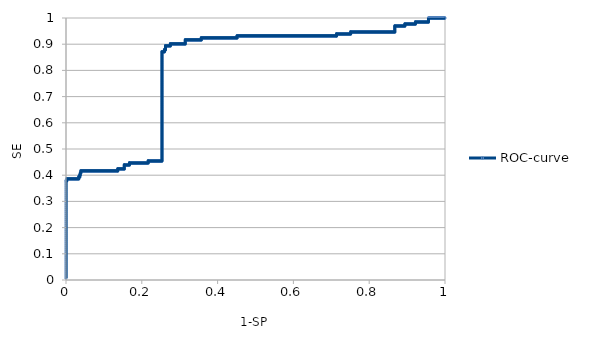
| Category | ROC-curve |
|---|---|
| 0.0 | 0.008 |
| 0.0 | 0.015 |
| 0.0 | 0.023 |
| 0.0 | 0.03 |
| 0.0 | 0.038 |
| 0.0 | 0.045 |
| 0.0 | 0.053 |
| 0.0 | 0.061 |
| 0.0 | 0.068 |
| 0.0 | 0.076 |
| 0.0 | 0.083 |
| 0.0 | 0.091 |
| 0.0 | 0.098 |
| 0.0 | 0.106 |
| 0.0 | 0.114 |
| 0.0 | 0.121 |
| 0.0 | 0.129 |
| 0.0 | 0.136 |
| 0.0 | 0.144 |
| 0.0 | 0.152 |
| 0.0 | 0.159 |
| 0.0 | 0.167 |
| 0.0 | 0.174 |
| 0.0 | 0.182 |
| 0.0 | 0.189 |
| 0.0 | 0.197 |
| 0.0 | 0.205 |
| 0.0 | 0.212 |
| 0.0 | 0.22 |
| 0.0 | 0.227 |
| 0.0 | 0.235 |
| 0.0 | 0.242 |
| 0.0 | 0.25 |
| 0.0 | 0.258 |
| 0.0 | 0.265 |
| 0.0 | 0.273 |
| 0.0 | 0.28 |
| 0.0 | 0.288 |
| 0.0 | 0.295 |
| 0.0 | 0.303 |
| 0.0 | 0.311 |
| 0.0 | 0.318 |
| 0.0 | 0.326 |
| 0.0 | 0.333 |
| 0.0 | 0.341 |
| 0.0 | 0.348 |
| 0.0 | 0.356 |
| 0.0 | 0.364 |
| 0.0 | 0.371 |
| 0.0 | 0.379 |
| 0.000715307582260349 | 0.379 |
| 0.0014306151645207 | 0.379 |
| 0.00214592274678116 | 0.379 |
| 0.00214592274678116 | 0.386 |
| 0.00286123032904151 | 0.386 |
| 0.00357653791130186 | 0.386 |
| 0.00429184549356221 | 0.386 |
| 0.00500715307582256 | 0.386 |
| 0.00572246065808302 | 0.386 |
| 0.00643776824034337 | 0.386 |
| 0.00715307582260372 | 0.386 |
| 0.00786838340486407 | 0.386 |
| 0.00858369098712442 | 0.386 |
| 0.00929899856938487 | 0.386 |
| 0.0100143061516452 | 0.386 |
| 0.0107296137339056 | 0.386 |
| 0.0114449213161659 | 0.386 |
| 0.0121602288984263 | 0.386 |
| 0.0128755364806867 | 0.386 |
| 0.0135908440629471 | 0.386 |
| 0.0143061516452074 | 0.386 |
| 0.0150214592274678 | 0.386 |
| 0.0157367668097281 | 0.386 |
| 0.0164520743919886 | 0.386 |
| 0.0171673819742489 | 0.386 |
| 0.0178826895565093 | 0.386 |
| 0.0185979971387696 | 0.386 |
| 0.01931330472103 | 0.386 |
| 0.0200286123032904 | 0.386 |
| 0.0207439198855508 | 0.386 |
| 0.0214592274678111 | 0.386 |
| 0.0221745350500715 | 0.386 |
| 0.022889842632332 | 0.386 |
| 0.0236051502145923 | 0.386 |
| 0.0243204577968527 | 0.386 |
| 0.025035765379113 | 0.386 |
| 0.0257510729613734 | 0.386 |
| 0.0264663805436338 | 0.386 |
| 0.0271816881258942 | 0.386 |
| 0.0278969957081545 | 0.386 |
| 0.0286123032904149 | 0.386 |
| 0.0293276108726752 | 0.386 |
| 0.0300429184549357 | 0.386 |
| 0.030758226037196 | 0.386 |
| 0.0314735336194564 | 0.386 |
| 0.0321888412017167 | 0.386 |
| 0.0329041487839771 | 0.386 |
| 0.0336194563662375 | 0.386 |
| 0.0336194563662375 | 0.394 |
| 0.0343347639484979 | 0.394 |
| 0.0350500715307582 | 0.394 |
| 0.0357653791130186 | 0.394 |
| 0.0364806866952789 | 0.394 |
| 0.0364806866952789 | 0.402 |
| 0.0371959942775394 | 0.402 |
| 0.0379113018597997 | 0.402 |
| 0.0379113018597997 | 0.409 |
| 0.0386266094420601 | 0.409 |
| 0.0393419170243204 | 0.409 |
| 0.0393419170243204 | 0.417 |
| 0.0400572246065808 | 0.417 |
| 0.0407725321888413 | 0.417 |
| 0.0414878397711016 | 0.417 |
| 0.042203147353362 | 0.417 |
| 0.0429184549356223 | 0.417 |
| 0.0436337625178826 | 0.417 |
| 0.0443490701001431 | 0.417 |
| 0.0450643776824035 | 0.417 |
| 0.0457796852646638 | 0.417 |
| 0.0464949928469242 | 0.417 |
| 0.0472103004291845 | 0.417 |
| 0.047925608011445 | 0.417 |
| 0.0486409155937053 | 0.417 |
| 0.0493562231759657 | 0.417 |
| 0.050071530758226 | 0.417 |
| 0.0507868383404864 | 0.417 |
| 0.0515021459227468 | 0.417 |
| 0.0522174535050072 | 0.417 |
| 0.0529327610872675 | 0.417 |
| 0.0536480686695279 | 0.417 |
| 0.0543633762517882 | 0.417 |
| 0.0550786838340487 | 0.417 |
| 0.055793991416309 | 0.417 |
| 0.0565092989985694 | 0.417 |
| 0.0572246065808297 | 0.417 |
| 0.0579399141630901 | 0.417 |
| 0.0586552217453505 | 0.417 |
| 0.0593705293276109 | 0.417 |
| 0.0600858369098712 | 0.417 |
| 0.0608011444921316 | 0.417 |
| 0.0615164520743919 | 0.417 |
| 0.0622317596566524 | 0.417 |
| 0.0629470672389127 | 0.417 |
| 0.0636623748211731 | 0.417 |
| 0.0643776824034334 | 0.417 |
| 0.0650929899856938 | 0.417 |
| 0.0658082975679543 | 0.417 |
| 0.0665236051502146 | 0.417 |
| 0.067238912732475 | 0.417 |
| 0.0679542203147353 | 0.417 |
| 0.0686695278969958 | 0.417 |
| 0.0693848354792561 | 0.417 |
| 0.0701001430615165 | 0.417 |
| 0.0708154506437768 | 0.417 |
| 0.0715307582260372 | 0.417 |
| 0.0722460658082976 | 0.417 |
| 0.072961373390558 | 0.417 |
| 0.0736766809728183 | 0.417 |
| 0.0743919885550787 | 0.417 |
| 0.075107296137339 | 0.417 |
| 0.0758226037195995 | 0.417 |
| 0.0765379113018598 | 0.417 |
| 0.0772532188841202 | 0.417 |
| 0.0779685264663805 | 0.417 |
| 0.0786838340486409 | 0.417 |
| 0.0793991416309013 | 0.417 |
| 0.0801144492131617 | 0.417 |
| 0.080829756795422 | 0.417 |
| 0.0815450643776824 | 0.417 |
| 0.0822603719599427 | 0.417 |
| 0.0829756795422032 | 0.417 |
| 0.0836909871244635 | 0.417 |
| 0.0844062947067239 | 0.417 |
| 0.0851216022889842 | 0.417 |
| 0.0858369098712446 | 0.417 |
| 0.0865522174535051 | 0.417 |
| 0.0872675250357654 | 0.417 |
| 0.0879828326180258 | 0.417 |
| 0.0886981402002861 | 0.417 |
| 0.0894134477825465 | 0.417 |
| 0.0901287553648069 | 0.417 |
| 0.0908440629470673 | 0.417 |
| 0.0915593705293276 | 0.417 |
| 0.092274678111588 | 0.417 |
| 0.0929899856938483 | 0.417 |
| 0.0937052932761088 | 0.417 |
| 0.0944206008583691 | 0.417 |
| 0.0951359084406295 | 0.417 |
| 0.0958512160228898 | 0.417 |
| 0.0965665236051502 | 0.417 |
| 0.0972818311874106 | 0.417 |
| 0.097997138769671 | 0.417 |
| 0.0987124463519313 | 0.417 |
| 0.0994277539341917 | 0.417 |
| 0.100143061516452 | 0.417 |
| 0.100858369098712 | 0.417 |
| 0.101573676680973 | 0.417 |
| 0.102288984263233 | 0.417 |
| 0.103004291845494 | 0.417 |
| 0.103719599427754 | 0.417 |
| 0.104434907010014 | 0.417 |
| 0.105150214592275 | 0.417 |
| 0.105865522174535 | 0.417 |
| 0.106580829756795 | 0.417 |
| 0.107296137339056 | 0.417 |
| 0.108011444921316 | 0.417 |
| 0.108726752503577 | 0.417 |
| 0.109442060085837 | 0.417 |
| 0.110157367668097 | 0.417 |
| 0.110872675250358 | 0.417 |
| 0.111587982832618 | 0.417 |
| 0.112303290414878 | 0.417 |
| 0.113018597997139 | 0.417 |
| 0.113733905579399 | 0.417 |
| 0.11444921316166 | 0.417 |
| 0.11516452074392 | 0.417 |
| 0.11587982832618 | 0.417 |
| 0.116595135908441 | 0.417 |
| 0.117310443490701 | 0.417 |
| 0.118025751072961 | 0.417 |
| 0.118741058655222 | 0.417 |
| 0.119456366237482 | 0.417 |
| 0.120171673819742 | 0.417 |
| 0.120886981402003 | 0.417 |
| 0.121602288984263 | 0.417 |
| 0.122317596566524 | 0.417 |
| 0.123032904148784 | 0.417 |
| 0.123748211731044 | 0.417 |
| 0.124463519313305 | 0.417 |
| 0.125178826895565 | 0.417 |
| 0.125894134477826 | 0.417 |
| 0.126609442060086 | 0.417 |
| 0.127324749642346 | 0.417 |
| 0.128040057224607 | 0.417 |
| 0.128755364806867 | 0.417 |
| 0.129470672389127 | 0.417 |
| 0.130185979971388 | 0.417 |
| 0.130901287553648 | 0.417 |
| 0.131616595135908 | 0.417 |
| 0.132331902718169 | 0.417 |
| 0.133047210300429 | 0.417 |
| 0.13376251788269 | 0.417 |
| 0.13447782546495 | 0.417 |
| 0.13519313304721 | 0.417 |
| 0.135908440629471 | 0.417 |
| 0.136623748211731 | 0.417 |
| 0.136623748211731 | 0.424 |
| 0.137339055793991 | 0.424 |
| 0.138054363376252 | 0.424 |
| 0.138769670958512 | 0.424 |
| 0.139484978540773 | 0.424 |
| 0.140200286123033 | 0.424 |
| 0.140915593705293 | 0.424 |
| 0.141630901287554 | 0.424 |
| 0.142346208869814 | 0.424 |
| 0.143061516452074 | 0.424 |
| 0.143776824034335 | 0.424 |
| 0.144492131616595 | 0.424 |
| 0.145207439198855 | 0.424 |
| 0.145922746781116 | 0.424 |
| 0.146638054363376 | 0.424 |
| 0.147353361945637 | 0.424 |
| 0.148068669527897 | 0.424 |
| 0.148783977110157 | 0.424 |
| 0.149499284692418 | 0.424 |
| 0.150214592274678 | 0.424 |
| 0.150929899856939 | 0.424 |
| 0.151645207439199 | 0.424 |
| 0.152360515021459 | 0.424 |
| 0.15307582260372 | 0.424 |
| 0.15379113018598 | 0.424 |
| 0.15379113018598 | 0.432 |
| 0.15379113018598 | 0.439 |
| 0.15450643776824 | 0.439 |
| 0.155221745350501 | 0.439 |
| 0.155937052932761 | 0.439 |
| 0.156652360515021 | 0.439 |
| 0.157367668097282 | 0.439 |
| 0.158082975679542 | 0.439 |
| 0.158798283261803 | 0.439 |
| 0.159513590844063 | 0.439 |
| 0.160228898426323 | 0.439 |
| 0.160944206008584 | 0.439 |
| 0.161659513590844 | 0.439 |
| 0.162374821173104 | 0.439 |
| 0.163090128755365 | 0.439 |
| 0.163805436337625 | 0.439 |
| 0.164520743919886 | 0.439 |
| 0.165236051502146 | 0.439 |
| 0.165951359084406 | 0.439 |
| 0.166666666666667 | 0.439 |
| 0.167381974248927 | 0.439 |
| 0.167381974248927 | 0.447 |
| 0.168097281831187 | 0.447 |
| 0.168812589413448 | 0.447 |
| 0.169527896995708 | 0.447 |
| 0.170243204577969 | 0.447 |
| 0.170958512160229 | 0.447 |
| 0.171673819742489 | 0.447 |
| 0.17238912732475 | 0.447 |
| 0.17310443490701 | 0.447 |
| 0.17381974248927 | 0.447 |
| 0.174535050071531 | 0.447 |
| 0.175250357653791 | 0.447 |
| 0.175965665236052 | 0.447 |
| 0.176680972818312 | 0.447 |
| 0.177396280400572 | 0.447 |
| 0.178111587982833 | 0.447 |
| 0.178826895565093 | 0.447 |
| 0.179542203147353 | 0.447 |
| 0.180257510729614 | 0.447 |
| 0.180972818311874 | 0.447 |
| 0.181688125894135 | 0.447 |
| 0.182403433476395 | 0.447 |
| 0.183118741058655 | 0.447 |
| 0.183834048640916 | 0.447 |
| 0.184549356223176 | 0.447 |
| 0.185264663805436 | 0.447 |
| 0.185979971387697 | 0.447 |
| 0.186695278969957 | 0.447 |
| 0.187410586552217 | 0.447 |
| 0.188125894134478 | 0.447 |
| 0.188841201716738 | 0.447 |
| 0.189556509298999 | 0.447 |
| 0.190271816881259 | 0.447 |
| 0.190987124463519 | 0.447 |
| 0.19170243204578 | 0.447 |
| 0.19241773962804 | 0.447 |
| 0.1931330472103 | 0.447 |
| 0.193848354792561 | 0.447 |
| 0.194563662374821 | 0.447 |
| 0.195278969957082 | 0.447 |
| 0.195994277539342 | 0.447 |
| 0.196709585121602 | 0.447 |
| 0.197424892703863 | 0.447 |
| 0.198140200286123 | 0.447 |
| 0.198855507868383 | 0.447 |
| 0.199570815450644 | 0.447 |
| 0.200286123032904 | 0.447 |
| 0.201001430615164 | 0.447 |
| 0.201716738197425 | 0.447 |
| 0.202432045779685 | 0.447 |
| 0.203147353361946 | 0.447 |
| 0.203862660944206 | 0.447 |
| 0.204577968526466 | 0.447 |
| 0.205293276108727 | 0.447 |
| 0.206008583690987 | 0.447 |
| 0.206723891273247 | 0.447 |
| 0.207439198855508 | 0.447 |
| 0.208154506437768 | 0.447 |
| 0.208869814020029 | 0.447 |
| 0.209585121602289 | 0.447 |
| 0.210300429184549 | 0.447 |
| 0.21101573676681 | 0.447 |
| 0.21173104434907 | 0.447 |
| 0.21244635193133 | 0.447 |
| 0.213161659513591 | 0.447 |
| 0.213876967095851 | 0.447 |
| 0.214592274678112 | 0.447 |
| 0.215307582260372 | 0.447 |
| 0.216022889842632 | 0.447 |
| 0.216738197424893 | 0.447 |
| 0.216738197424893 | 0.455 |
| 0.217453505007153 | 0.455 |
| 0.218168812589413 | 0.455 |
| 0.218884120171674 | 0.455 |
| 0.219599427753934 | 0.455 |
| 0.220314735336195 | 0.455 |
| 0.221030042918455 | 0.455 |
| 0.221745350500715 | 0.455 |
| 0.222460658082976 | 0.455 |
| 0.223175965665236 | 0.455 |
| 0.223891273247496 | 0.455 |
| 0.224606580829757 | 0.455 |
| 0.225321888412017 | 0.455 |
| 0.226037195994278 | 0.455 |
| 0.226752503576538 | 0.455 |
| 0.227467811158798 | 0.455 |
| 0.228183118741059 | 0.455 |
| 0.228898426323319 | 0.455 |
| 0.229613733905579 | 0.455 |
| 0.23032904148784 | 0.455 |
| 0.2310443490701 | 0.455 |
| 0.231759656652361 | 0.455 |
| 0.232474964234621 | 0.455 |
| 0.233190271816881 | 0.455 |
| 0.233905579399142 | 0.455 |
| 0.234620886981402 | 0.455 |
| 0.235336194563662 | 0.455 |
| 0.236051502145923 | 0.455 |
| 0.236766809728183 | 0.455 |
| 0.237482117310443 | 0.455 |
| 0.238197424892704 | 0.455 |
| 0.238912732474964 | 0.455 |
| 0.239628040057225 | 0.455 |
| 0.240343347639485 | 0.455 |
| 0.241058655221745 | 0.455 |
| 0.241773962804006 | 0.455 |
| 0.242489270386266 | 0.455 |
| 0.243204577968526 | 0.455 |
| 0.243919885550787 | 0.455 |
| 0.244635193133047 | 0.455 |
| 0.245350500715308 | 0.455 |
| 0.246065808297568 | 0.455 |
| 0.246781115879828 | 0.455 |
| 0.247496423462089 | 0.455 |
| 0.248211731044349 | 0.455 |
| 0.248927038626609 | 0.455 |
| 0.24964234620887 | 0.455 |
| 0.25035765379113 | 0.455 |
| 0.25107296137339 | 0.455 |
| 0.251788268955651 | 0.455 |
| 0.252503576537911 | 0.455 |
| 0.253218884120172 | 0.455 |
| 0.253218884120172 | 0.462 |
| 0.253218884120172 | 0.47 |
| 0.253218884120172 | 0.477 |
| 0.253218884120172 | 0.485 |
| 0.253218884120172 | 0.492 |
| 0.253218884120172 | 0.5 |
| 0.253218884120172 | 0.508 |
| 0.253218884120172 | 0.515 |
| 0.253218884120172 | 0.523 |
| 0.253218884120172 | 0.53 |
| 0.253218884120172 | 0.538 |
| 0.253218884120172 | 0.545 |
| 0.253218884120172 | 0.553 |
| 0.253218884120172 | 0.561 |
| 0.253218884120172 | 0.568 |
| 0.253218884120172 | 0.576 |
| 0.253218884120172 | 0.583 |
| 0.253218884120172 | 0.591 |
| 0.253218884120172 | 0.598 |
| 0.253218884120172 | 0.606 |
| 0.253218884120172 | 0.614 |
| 0.253218884120172 | 0.621 |
| 0.253218884120172 | 0.629 |
| 0.253218884120172 | 0.636 |
| 0.253218884120172 | 0.644 |
| 0.253218884120172 | 0.652 |
| 0.253218884120172 | 0.659 |
| 0.253218884120172 | 0.667 |
| 0.253218884120172 | 0.674 |
| 0.253218884120172 | 0.682 |
| 0.253218884120172 | 0.689 |
| 0.253218884120172 | 0.697 |
| 0.253218884120172 | 0.705 |
| 0.253218884120172 | 0.712 |
| 0.253218884120172 | 0.72 |
| 0.253218884120172 | 0.727 |
| 0.253218884120172 | 0.735 |
| 0.253218884120172 | 0.742 |
| 0.253218884120172 | 0.75 |
| 0.253218884120172 | 0.758 |
| 0.253218884120172 | 0.765 |
| 0.253218884120172 | 0.773 |
| 0.253218884120172 | 0.78 |
| 0.253218884120172 | 0.788 |
| 0.253218884120172 | 0.795 |
| 0.253218884120172 | 0.803 |
| 0.253218884120172 | 0.811 |
| 0.253218884120172 | 0.818 |
| 0.253218884120172 | 0.826 |
| 0.253218884120172 | 0.833 |
| 0.253218884120172 | 0.841 |
| 0.253218884120172 | 0.848 |
| 0.253218884120172 | 0.856 |
| 0.253218884120172 | 0.864 |
| 0.253218884120172 | 0.871 |
| 0.253934191702432 | 0.871 |
| 0.254649499284692 | 0.871 |
| 0.255364806866953 | 0.871 |
| 0.256080114449213 | 0.871 |
| 0.256795422031474 | 0.871 |
| 0.257510729613734 | 0.871 |
| 0.258226037195994 | 0.871 |
| 0.258941344778255 | 0.871 |
| 0.259656652360515 | 0.871 |
| 0.259656652360515 | 0.879 |
| 0.260371959942775 | 0.879 |
| 0.261087267525036 | 0.879 |
| 0.261802575107296 | 0.879 |
| 0.262517882689557 | 0.879 |
| 0.262517882689557 | 0.886 |
| 0.262517882689557 | 0.894 |
| 0.263233190271817 | 0.894 |
| 0.263948497854077 | 0.894 |
| 0.264663805436338 | 0.894 |
| 0.265379113018598 | 0.894 |
| 0.266094420600858 | 0.894 |
| 0.266809728183119 | 0.894 |
| 0.267525035765379 | 0.894 |
| 0.268240343347639 | 0.894 |
| 0.2689556509299 | 0.894 |
| 0.26967095851216 | 0.894 |
| 0.270386266094421 | 0.894 |
| 0.271101573676681 | 0.894 |
| 0.271816881258941 | 0.894 |
| 0.272532188841202 | 0.894 |
| 0.273247496423462 | 0.894 |
| 0.273962804005722 | 0.894 |
| 0.274678111587983 | 0.894 |
| 0.275393419170243 | 0.894 |
| 0.275393419170243 | 0.902 |
| 0.276108726752504 | 0.902 |
| 0.276824034334764 | 0.902 |
| 0.277539341917024 | 0.902 |
| 0.278254649499285 | 0.902 |
| 0.278969957081545 | 0.902 |
| 0.279685264663805 | 0.902 |
| 0.280400572246066 | 0.902 |
| 0.281115879828326 | 0.902 |
| 0.281831187410587 | 0.902 |
| 0.282546494992847 | 0.902 |
| 0.283261802575107 | 0.902 |
| 0.283977110157368 | 0.902 |
| 0.284692417739628 | 0.902 |
| 0.285407725321888 | 0.902 |
| 0.286123032904149 | 0.902 |
| 0.286838340486409 | 0.902 |
| 0.28755364806867 | 0.902 |
| 0.28826895565093 | 0.902 |
| 0.28898426323319 | 0.902 |
| 0.289699570815451 | 0.902 |
| 0.290414878397711 | 0.902 |
| 0.291130185979971 | 0.902 |
| 0.291845493562232 | 0.902 |
| 0.292560801144492 | 0.902 |
| 0.293276108726752 | 0.902 |
| 0.293991416309013 | 0.902 |
| 0.294706723891273 | 0.902 |
| 0.295422031473534 | 0.902 |
| 0.296137339055794 | 0.902 |
| 0.296852646638054 | 0.902 |
| 0.297567954220315 | 0.902 |
| 0.298283261802575 | 0.902 |
| 0.298998569384835 | 0.902 |
| 0.299713876967096 | 0.902 |
| 0.300429184549356 | 0.902 |
| 0.301144492131617 | 0.902 |
| 0.301859799713877 | 0.902 |
| 0.302575107296137 | 0.902 |
| 0.303290414878398 | 0.902 |
| 0.304005722460658 | 0.902 |
| 0.304721030042918 | 0.902 |
| 0.305436337625179 | 0.902 |
| 0.306151645207439 | 0.902 |
| 0.3068669527897 | 0.902 |
| 0.30758226037196 | 0.902 |
| 0.30829756795422 | 0.902 |
| 0.309012875536481 | 0.902 |
| 0.309728183118741 | 0.902 |
| 0.310443490701001 | 0.902 |
| 0.311158798283262 | 0.902 |
| 0.311874105865522 | 0.902 |
| 0.312589413447783 | 0.902 |
| 0.313304721030043 | 0.902 |
| 0.314020028612303 | 0.902 |
| 0.314735336194564 | 0.902 |
| 0.314735336194564 | 0.909 |
| 0.314735336194564 | 0.917 |
| 0.315450643776824 | 0.917 |
| 0.316165951359084 | 0.917 |
| 0.316881258941345 | 0.917 |
| 0.317596566523605 | 0.917 |
| 0.318311874105865 | 0.917 |
| 0.319027181688126 | 0.917 |
| 0.319742489270386 | 0.917 |
| 0.320457796852647 | 0.917 |
| 0.321173104434907 | 0.917 |
| 0.321888412017167 | 0.917 |
| 0.322603719599428 | 0.917 |
| 0.323319027181688 | 0.917 |
| 0.324034334763948 | 0.917 |
| 0.324749642346209 | 0.917 |
| 0.325464949928469 | 0.917 |
| 0.32618025751073 | 0.917 |
| 0.32689556509299 | 0.917 |
| 0.32761087267525 | 0.917 |
| 0.328326180257511 | 0.917 |
| 0.329041487839771 | 0.917 |
| 0.329756795422032 | 0.917 |
| 0.330472103004292 | 0.917 |
| 0.331187410586552 | 0.917 |
| 0.331902718168813 | 0.917 |
| 0.332618025751073 | 0.917 |
| 0.333333333333333 | 0.917 |
| 0.334048640915594 | 0.917 |
| 0.334763948497854 | 0.917 |
| 0.335479256080114 | 0.917 |
| 0.336194563662375 | 0.917 |
| 0.336909871244635 | 0.917 |
| 0.337625178826896 | 0.917 |
| 0.338340486409156 | 0.917 |
| 0.339055793991416 | 0.917 |
| 0.339771101573677 | 0.917 |
| 0.340486409155937 | 0.917 |
| 0.341201716738197 | 0.917 |
| 0.341917024320458 | 0.917 |
| 0.342632331902718 | 0.917 |
| 0.343347639484979 | 0.917 |
| 0.344062947067239 | 0.917 |
| 0.344778254649499 | 0.917 |
| 0.34549356223176 | 0.917 |
| 0.34620886981402 | 0.917 |
| 0.34692417739628 | 0.917 |
| 0.347639484978541 | 0.917 |
| 0.348354792560801 | 0.917 |
| 0.349070100143061 | 0.917 |
| 0.349785407725322 | 0.917 |
| 0.350500715307582 | 0.917 |
| 0.351216022889843 | 0.917 |
| 0.351931330472103 | 0.917 |
| 0.352646638054363 | 0.917 |
| 0.353361945636624 | 0.917 |
| 0.354077253218884 | 0.917 |
| 0.354792560801144 | 0.917 |
| 0.355507868383405 | 0.917 |
| 0.356223175965665 | 0.917 |
| 0.356938483547926 | 0.917 |
| 0.356938483547926 | 0.924 |
| 0.357653791130186 | 0.924 |
| 0.358369098712446 | 0.924 |
| 0.359084406294707 | 0.924 |
| 0.359799713876967 | 0.924 |
| 0.360515021459227 | 0.924 |
| 0.361230329041488 | 0.924 |
| 0.361945636623748 | 0.924 |
| 0.362660944206009 | 0.924 |
| 0.363376251788269 | 0.924 |
| 0.364091559370529 | 0.924 |
| 0.36480686695279 | 0.924 |
| 0.36552217453505 | 0.924 |
| 0.36623748211731 | 0.924 |
| 0.366952789699571 | 0.924 |
| 0.367668097281831 | 0.924 |
| 0.368383404864092 | 0.924 |
| 0.369098712446352 | 0.924 |
| 0.369814020028612 | 0.924 |
| 0.370529327610873 | 0.924 |
| 0.371244635193133 | 0.924 |
| 0.371959942775393 | 0.924 |
| 0.372675250357654 | 0.924 |
| 0.373390557939914 | 0.924 |
| 0.374105865522174 | 0.924 |
| 0.374821173104435 | 0.924 |
| 0.375536480686695 | 0.924 |
| 0.376251788268956 | 0.924 |
| 0.376967095851216 | 0.924 |
| 0.377682403433476 | 0.924 |
| 0.378397711015737 | 0.924 |
| 0.379113018597997 | 0.924 |
| 0.379828326180258 | 0.924 |
| 0.380543633762518 | 0.924 |
| 0.381258941344778 | 0.924 |
| 0.381974248927039 | 0.924 |
| 0.382689556509299 | 0.924 |
| 0.383404864091559 | 0.924 |
| 0.38412017167382 | 0.924 |
| 0.38483547925608 | 0.924 |
| 0.38555078683834 | 0.924 |
| 0.386266094420601 | 0.924 |
| 0.386981402002861 | 0.924 |
| 0.387696709585122 | 0.924 |
| 0.388412017167382 | 0.924 |
| 0.389127324749642 | 0.924 |
| 0.389842632331903 | 0.924 |
| 0.390557939914163 | 0.924 |
| 0.391273247496423 | 0.924 |
| 0.391988555078684 | 0.924 |
| 0.392703862660944 | 0.924 |
| 0.393419170243205 | 0.924 |
| 0.394134477825465 | 0.924 |
| 0.394849785407725 | 0.924 |
| 0.395565092989986 | 0.924 |
| 0.396280400572246 | 0.924 |
| 0.396995708154506 | 0.924 |
| 0.397711015736767 | 0.924 |
| 0.398426323319027 | 0.924 |
| 0.399141630901287 | 0.924 |
| 0.399856938483548 | 0.924 |
| 0.400572246065808 | 0.924 |
| 0.401287553648069 | 0.924 |
| 0.402002861230329 | 0.924 |
| 0.402718168812589 | 0.924 |
| 0.40343347639485 | 0.924 |
| 0.40414878397711 | 0.924 |
| 0.40486409155937 | 0.924 |
| 0.405579399141631 | 0.924 |
| 0.406294706723891 | 0.924 |
| 0.407010014306152 | 0.924 |
| 0.407725321888412 | 0.924 |
| 0.408440629470672 | 0.924 |
| 0.409155937052933 | 0.924 |
| 0.409871244635193 | 0.924 |
| 0.410586552217454 | 0.924 |
| 0.411301859799714 | 0.924 |
| 0.412017167381974 | 0.924 |
| 0.412732474964235 | 0.924 |
| 0.413447782546495 | 0.924 |
| 0.414163090128755 | 0.924 |
| 0.414878397711016 | 0.924 |
| 0.415593705293276 | 0.924 |
| 0.416309012875536 | 0.924 |
| 0.417024320457797 | 0.924 |
| 0.417739628040057 | 0.924 |
| 0.418454935622318 | 0.924 |
| 0.419170243204578 | 0.924 |
| 0.419885550786838 | 0.924 |
| 0.420600858369099 | 0.924 |
| 0.421316165951359 | 0.924 |
| 0.42203147353362 | 0.924 |
| 0.42274678111588 | 0.924 |
| 0.42346208869814 | 0.924 |
| 0.424177396280401 | 0.924 |
| 0.424892703862661 | 0.924 |
| 0.425608011444921 | 0.924 |
| 0.426323319027182 | 0.924 |
| 0.427038626609442 | 0.924 |
| 0.427753934191702 | 0.924 |
| 0.428469241773963 | 0.924 |
| 0.429184549356223 | 0.924 |
| 0.429899856938484 | 0.924 |
| 0.430615164520744 | 0.924 |
| 0.431330472103004 | 0.924 |
| 0.432045779685265 | 0.924 |
| 0.432761087267525 | 0.924 |
| 0.433476394849785 | 0.924 |
| 0.434191702432046 | 0.924 |
| 0.434907010014306 | 0.924 |
| 0.435622317596567 | 0.924 |
| 0.436337625178827 | 0.924 |
| 0.437052932761087 | 0.924 |
| 0.437768240343348 | 0.924 |
| 0.438483547925608 | 0.924 |
| 0.439198855507868 | 0.924 |
| 0.439914163090129 | 0.924 |
| 0.440629470672389 | 0.924 |
| 0.441344778254649 | 0.924 |
| 0.44206008583691 | 0.924 |
| 0.44277539341917 | 0.924 |
| 0.443490701001431 | 0.924 |
| 0.444206008583691 | 0.924 |
| 0.444921316165951 | 0.924 |
| 0.445636623748212 | 0.924 |
| 0.446351931330472 | 0.924 |
| 0.447067238912732 | 0.924 |
| 0.447782546494993 | 0.924 |
| 0.448497854077253 | 0.924 |
| 0.449213161659514 | 0.924 |
| 0.449928469241774 | 0.924 |
| 0.450643776824034 | 0.924 |
| 0.451359084406295 | 0.924 |
| 0.451359084406295 | 0.932 |
| 0.452074391988555 | 0.932 |
| 0.452789699570815 | 0.932 |
| 0.453505007153076 | 0.932 |
| 0.454220314735336 | 0.932 |
| 0.454935622317597 | 0.932 |
| 0.455650929899857 | 0.932 |
| 0.456366237482117 | 0.932 |
| 0.457081545064378 | 0.932 |
| 0.457796852646638 | 0.932 |
| 0.458512160228898 | 0.932 |
| 0.459227467811159 | 0.932 |
| 0.459942775393419 | 0.932 |
| 0.46065808297568 | 0.932 |
| 0.46137339055794 | 0.932 |
| 0.4620886981402 | 0.932 |
| 0.462804005722461 | 0.932 |
| 0.463519313304721 | 0.932 |
| 0.464234620886981 | 0.932 |
| 0.464949928469242 | 0.932 |
| 0.465665236051502 | 0.932 |
| 0.466380543633763 | 0.932 |
| 0.467095851216023 | 0.932 |
| 0.467811158798283 | 0.932 |
| 0.468526466380544 | 0.932 |
| 0.469241773962804 | 0.932 |
| 0.469957081545064 | 0.932 |
| 0.470672389127325 | 0.932 |
| 0.471387696709585 | 0.932 |
| 0.472103004291845 | 0.932 |
| 0.472818311874106 | 0.932 |
| 0.473533619456366 | 0.932 |
| 0.474248927038627 | 0.932 |
| 0.474964234620887 | 0.932 |
| 0.475679542203147 | 0.932 |
| 0.476394849785408 | 0.932 |
| 0.477110157367668 | 0.932 |
| 0.477825464949929 | 0.932 |
| 0.478540772532189 | 0.932 |
| 0.479256080114449 | 0.932 |
| 0.47997138769671 | 0.932 |
| 0.48068669527897 | 0.932 |
| 0.48140200286123 | 0.932 |
| 0.482117310443491 | 0.932 |
| 0.482832618025751 | 0.932 |
| 0.483547925608011 | 0.932 |
| 0.484263233190272 | 0.932 |
| 0.484978540772532 | 0.932 |
| 0.485693848354793 | 0.932 |
| 0.486409155937053 | 0.932 |
| 0.487124463519313 | 0.932 |
| 0.487839771101574 | 0.932 |
| 0.488555078683834 | 0.932 |
| 0.489270386266094 | 0.932 |
| 0.489985693848355 | 0.932 |
| 0.490701001430615 | 0.932 |
| 0.491416309012876 | 0.932 |
| 0.492131616595136 | 0.932 |
| 0.492846924177396 | 0.932 |
| 0.493562231759657 | 0.932 |
| 0.494277539341917 | 0.932 |
| 0.494992846924177 | 0.932 |
| 0.495708154506438 | 0.932 |
| 0.496423462088698 | 0.932 |
| 0.497138769670958 | 0.932 |
| 0.497854077253219 | 0.932 |
| 0.498569384835479 | 0.932 |
| 0.49928469241774 | 0.932 |
| 0.5 | 0.932 |
| 0.50071530758226 | 0.932 |
| 0.501430615164521 | 0.932 |
| 0.502145922746781 | 0.932 |
| 0.502861230329042 | 0.932 |
| 0.503576537911302 | 0.932 |
| 0.504291845493562 | 0.932 |
| 0.505007153075823 | 0.932 |
| 0.505722460658083 | 0.932 |
| 0.506437768240343 | 0.932 |
| 0.507153075822604 | 0.932 |
| 0.507868383404864 | 0.932 |
| 0.508583690987124 | 0.932 |
| 0.509298998569385 | 0.932 |
| 0.510014306151645 | 0.932 |
| 0.510729613733906 | 0.932 |
| 0.511444921316166 | 0.932 |
| 0.512160228898426 | 0.932 |
| 0.512875536480687 | 0.932 |
| 0.513590844062947 | 0.932 |
| 0.514306151645207 | 0.932 |
| 0.515021459227468 | 0.932 |
| 0.515736766809728 | 0.932 |
| 0.516452074391988 | 0.932 |
| 0.517167381974249 | 0.932 |
| 0.517882689556509 | 0.932 |
| 0.51859799713877 | 0.932 |
| 0.51931330472103 | 0.932 |
| 0.52002861230329 | 0.932 |
| 0.520743919885551 | 0.932 |
| 0.521459227467811 | 0.932 |
| 0.522174535050072 | 0.932 |
| 0.522889842632332 | 0.932 |
| 0.523605150214592 | 0.932 |
| 0.524320457796853 | 0.932 |
| 0.525035765379113 | 0.932 |
| 0.525751072961373 | 0.932 |
| 0.526466380543634 | 0.932 |
| 0.527181688125894 | 0.932 |
| 0.527896995708155 | 0.932 |
| 0.528612303290415 | 0.932 |
| 0.529327610872675 | 0.932 |
| 0.530042918454936 | 0.932 |
| 0.530758226037196 | 0.932 |
| 0.531473533619456 | 0.932 |
| 0.532188841201717 | 0.932 |
| 0.532904148783977 | 0.932 |
| 0.533619456366238 | 0.932 |
| 0.534334763948498 | 0.932 |
| 0.535050071530758 | 0.932 |
| 0.535765379113019 | 0.932 |
| 0.536480686695279 | 0.932 |
| 0.537195994277539 | 0.932 |
| 0.5379113018598 | 0.932 |
| 0.53862660944206 | 0.932 |
| 0.53934191702432 | 0.932 |
| 0.540057224606581 | 0.932 |
| 0.540772532188841 | 0.932 |
| 0.541487839771102 | 0.932 |
| 0.542203147353362 | 0.932 |
| 0.542918454935622 | 0.932 |
| 0.543633762517883 | 0.932 |
| 0.544349070100143 | 0.932 |
| 0.545064377682403 | 0.932 |
| 0.545779685264664 | 0.932 |
| 0.546494992846924 | 0.932 |
| 0.547210300429185 | 0.932 |
| 0.547925608011445 | 0.932 |
| 0.548640915593705 | 0.932 |
| 0.549356223175966 | 0.932 |
| 0.550071530758226 | 0.932 |
| 0.550786838340486 | 0.932 |
| 0.551502145922747 | 0.932 |
| 0.552217453505007 | 0.932 |
| 0.552932761087267 | 0.932 |
| 0.553648068669528 | 0.932 |
| 0.554363376251788 | 0.932 |
| 0.555078683834049 | 0.932 |
| 0.555793991416309 | 0.932 |
| 0.556509298998569 | 0.932 |
| 0.55722460658083 | 0.932 |
| 0.55793991416309 | 0.932 |
| 0.55865522174535 | 0.932 |
| 0.559370529327611 | 0.932 |
| 0.560085836909871 | 0.932 |
| 0.560801144492132 | 0.932 |
| 0.561516452074392 | 0.932 |
| 0.562231759656652 | 0.932 |
| 0.562947067238913 | 0.932 |
| 0.563662374821173 | 0.932 |
| 0.564377682403433 | 0.932 |
| 0.565092989985694 | 0.932 |
| 0.565808297567954 | 0.932 |
| 0.566523605150215 | 0.932 |
| 0.567238912732475 | 0.932 |
| 0.567954220314735 | 0.932 |
| 0.568669527896996 | 0.932 |
| 0.569384835479256 | 0.932 |
| 0.570100143061516 | 0.932 |
| 0.570815450643777 | 0.932 |
| 0.571530758226037 | 0.932 |
| 0.572246065808297 | 0.932 |
| 0.572961373390558 | 0.932 |
| 0.573676680972818 | 0.932 |
| 0.574391988555079 | 0.932 |
| 0.575107296137339 | 0.932 |
| 0.575822603719599 | 0.932 |
| 0.57653791130186 | 0.932 |
| 0.57725321888412 | 0.932 |
| 0.577968526466381 | 0.932 |
| 0.578683834048641 | 0.932 |
| 0.579399141630901 | 0.932 |
| 0.580114449213162 | 0.932 |
| 0.580829756795422 | 0.932 |
| 0.581545064377682 | 0.932 |
| 0.582260371959943 | 0.932 |
| 0.582975679542203 | 0.932 |
| 0.583690987124464 | 0.932 |
| 0.584406294706724 | 0.932 |
| 0.585121602288984 | 0.932 |
| 0.585836909871245 | 0.932 |
| 0.586552217453505 | 0.932 |
| 0.587267525035765 | 0.932 |
| 0.587982832618026 | 0.932 |
| 0.588698140200286 | 0.932 |
| 0.589413447782547 | 0.932 |
| 0.590128755364807 | 0.932 |
| 0.590844062947067 | 0.932 |
| 0.591559370529328 | 0.932 |
| 0.592274678111588 | 0.932 |
| 0.592989985693848 | 0.932 |
| 0.593705293276109 | 0.932 |
| 0.594420600858369 | 0.932 |
| 0.595135908440629 | 0.932 |
| 0.59585121602289 | 0.932 |
| 0.59656652360515 | 0.932 |
| 0.597281831187411 | 0.932 |
| 0.597997138769671 | 0.932 |
| 0.598712446351931 | 0.932 |
| 0.599427753934192 | 0.932 |
| 0.600143061516452 | 0.932 |
| 0.600858369098712 | 0.932 |
| 0.601573676680973 | 0.932 |
| 0.602288984263233 | 0.932 |
| 0.603004291845494 | 0.932 |
| 0.603719599427754 | 0.932 |
| 0.604434907010014 | 0.932 |
| 0.605150214592275 | 0.932 |
| 0.605865522174535 | 0.932 |
| 0.606580829756795 | 0.932 |
| 0.607296137339056 | 0.932 |
| 0.608011444921316 | 0.932 |
| 0.608726752503577 | 0.932 |
| 0.609442060085837 | 0.932 |
| 0.610157367668097 | 0.932 |
| 0.610872675250358 | 0.932 |
| 0.611587982832618 | 0.932 |
| 0.612303290414878 | 0.932 |
| 0.613018597997139 | 0.932 |
| 0.613733905579399 | 0.932 |
| 0.614449213161659 | 0.932 |
| 0.61516452074392 | 0.932 |
| 0.61587982832618 | 0.932 |
| 0.616595135908441 | 0.932 |
| 0.617310443490701 | 0.932 |
| 0.618025751072961 | 0.932 |
| 0.618741058655222 | 0.932 |
| 0.619456366237482 | 0.932 |
| 0.620171673819742 | 0.932 |
| 0.620886981402003 | 0.932 |
| 0.621602288984263 | 0.932 |
| 0.622317596566524 | 0.932 |
| 0.623032904148784 | 0.932 |
| 0.623748211731044 | 0.932 |
| 0.624463519313305 | 0.932 |
| 0.625178826895565 | 0.932 |
| 0.625894134477826 | 0.932 |
| 0.626609442060086 | 0.932 |
| 0.627324749642346 | 0.932 |
| 0.628040057224607 | 0.932 |
| 0.628755364806867 | 0.932 |
| 0.629470672389127 | 0.932 |
| 0.630185979971388 | 0.932 |
| 0.630901287553648 | 0.932 |
| 0.631616595135908 | 0.932 |
| 0.632331902718169 | 0.932 |
| 0.633047210300429 | 0.932 |
| 0.63376251788269 | 0.932 |
| 0.63447782546495 | 0.932 |
| 0.63519313304721 | 0.932 |
| 0.635908440629471 | 0.932 |
| 0.636623748211731 | 0.932 |
| 0.637339055793991 | 0.932 |
| 0.638054363376252 | 0.932 |
| 0.638769670958512 | 0.932 |
| 0.639484978540773 | 0.932 |
| 0.640200286123033 | 0.932 |
| 0.640915593705293 | 0.932 |
| 0.641630901287554 | 0.932 |
| 0.642346208869814 | 0.932 |
| 0.643061516452074 | 0.932 |
| 0.643776824034335 | 0.932 |
| 0.644492131616595 | 0.932 |
| 0.645207439198855 | 0.932 |
| 0.645922746781116 | 0.932 |
| 0.646638054363376 | 0.932 |
| 0.647353361945637 | 0.932 |
| 0.648068669527897 | 0.932 |
| 0.648783977110157 | 0.932 |
| 0.649499284692418 | 0.932 |
| 0.650214592274678 | 0.932 |
| 0.650929899856939 | 0.932 |
| 0.651645207439199 | 0.932 |
| 0.652360515021459 | 0.932 |
| 0.65307582260372 | 0.932 |
| 0.65379113018598 | 0.932 |
| 0.65450643776824 | 0.932 |
| 0.655221745350501 | 0.932 |
| 0.655937052932761 | 0.932 |
| 0.656652360515021 | 0.932 |
| 0.657367668097282 | 0.932 |
| 0.658082975679542 | 0.932 |
| 0.658798283261803 | 0.932 |
| 0.659513590844063 | 0.932 |
| 0.660228898426323 | 0.932 |
| 0.660944206008584 | 0.932 |
| 0.661659513590844 | 0.932 |
| 0.662374821173104 | 0.932 |
| 0.663090128755365 | 0.932 |
| 0.663805436337625 | 0.932 |
| 0.664520743919885 | 0.932 |
| 0.665236051502146 | 0.932 |
| 0.665951359084406 | 0.932 |
| 0.666666666666667 | 0.932 |
| 0.667381974248927 | 0.932 |
| 0.668097281831187 | 0.932 |
| 0.668812589413448 | 0.932 |
| 0.669527896995708 | 0.932 |
| 0.670243204577969 | 0.932 |
| 0.670958512160229 | 0.932 |
| 0.671673819742489 | 0.932 |
| 0.67238912732475 | 0.932 |
| 0.67310443490701 | 0.932 |
| 0.67381974248927 | 0.932 |
| 0.674535050071531 | 0.932 |
| 0.675250357653791 | 0.932 |
| 0.675965665236051 | 0.932 |
| 0.676680972818312 | 0.932 |
| 0.677396280400572 | 0.932 |
| 0.678111587982833 | 0.932 |
| 0.678826895565093 | 0.932 |
| 0.679542203147353 | 0.932 |
| 0.680257510729614 | 0.932 |
| 0.680972818311874 | 0.932 |
| 0.681688125894135 | 0.932 |
| 0.682403433476395 | 0.932 |
| 0.683118741058655 | 0.932 |
| 0.683834048640916 | 0.932 |
| 0.684549356223176 | 0.932 |
| 0.685264663805436 | 0.932 |
| 0.685979971387697 | 0.932 |
| 0.686695278969957 | 0.932 |
| 0.687410586552217 | 0.932 |
| 0.688125894134478 | 0.932 |
| 0.688841201716738 | 0.932 |
| 0.689556509298999 | 0.932 |
| 0.690271816881259 | 0.932 |
| 0.690987124463519 | 0.932 |
| 0.69170243204578 | 0.932 |
| 0.69241773962804 | 0.932 |
| 0.6931330472103 | 0.932 |
| 0.693848354792561 | 0.932 |
| 0.694563662374821 | 0.932 |
| 0.695278969957082 | 0.932 |
| 0.695994277539342 | 0.932 |
| 0.696709585121602 | 0.932 |
| 0.697424892703863 | 0.932 |
| 0.698140200286123 | 0.932 |
| 0.698855507868383 | 0.932 |
| 0.699570815450644 | 0.932 |
| 0.700286123032904 | 0.932 |
| 0.701001430615164 | 0.932 |
| 0.701716738197425 | 0.932 |
| 0.702432045779685 | 0.932 |
| 0.703147353361946 | 0.932 |
| 0.703862660944206 | 0.932 |
| 0.704577968526466 | 0.932 |
| 0.705293276108727 | 0.932 |
| 0.706008583690987 | 0.932 |
| 0.706723891273247 | 0.932 |
| 0.707439198855508 | 0.932 |
| 0.708154506437768 | 0.932 |
| 0.708869814020029 | 0.932 |
| 0.709585121602289 | 0.932 |
| 0.710300429184549 | 0.932 |
| 0.71101573676681 | 0.932 |
| 0.71173104434907 | 0.932 |
| 0.71244635193133 | 0.932 |
| 0.713161659513591 | 0.932 |
| 0.713876967095851 | 0.932 |
| 0.713876967095851 | 0.939 |
| 0.714592274678112 | 0.939 |
| 0.715307582260372 | 0.939 |
| 0.716022889842632 | 0.939 |
| 0.716738197424893 | 0.939 |
| 0.717453505007153 | 0.939 |
| 0.718168812589413 | 0.939 |
| 0.718884120171674 | 0.939 |
| 0.719599427753934 | 0.939 |
| 0.720314735336194 | 0.939 |
| 0.721030042918455 | 0.939 |
| 0.721745350500715 | 0.939 |
| 0.722460658082976 | 0.939 |
| 0.723175965665236 | 0.939 |
| 0.723891273247496 | 0.939 |
| 0.724606580829757 | 0.939 |
| 0.725321888412017 | 0.939 |
| 0.726037195994278 | 0.939 |
| 0.726752503576538 | 0.939 |
| 0.727467811158798 | 0.939 |
| 0.728183118741059 | 0.939 |
| 0.728898426323319 | 0.939 |
| 0.729613733905579 | 0.939 |
| 0.73032904148784 | 0.939 |
| 0.7310443490701 | 0.939 |
| 0.731759656652361 | 0.939 |
| 0.732474964234621 | 0.939 |
| 0.733190271816881 | 0.939 |
| 0.733905579399142 | 0.939 |
| 0.734620886981402 | 0.939 |
| 0.735336194563662 | 0.939 |
| 0.736051502145923 | 0.939 |
| 0.736766809728183 | 0.939 |
| 0.737482117310444 | 0.939 |
| 0.738197424892704 | 0.939 |
| 0.738912732474964 | 0.939 |
| 0.739628040057225 | 0.939 |
| 0.740343347639485 | 0.939 |
| 0.741058655221745 | 0.939 |
| 0.741773962804006 | 0.939 |
| 0.742489270386266 | 0.939 |
| 0.743204577968526 | 0.939 |
| 0.743919885550787 | 0.939 |
| 0.744635193133047 | 0.939 |
| 0.745350500715308 | 0.939 |
| 0.746065808297568 | 0.939 |
| 0.746781115879828 | 0.939 |
| 0.747496423462089 | 0.939 |
| 0.748211731044349 | 0.939 |
| 0.748927038626609 | 0.939 |
| 0.74964234620887 | 0.939 |
| 0.75035765379113 | 0.939 |
| 0.751072961373391 | 0.939 |
| 0.751072961373391 | 0.947 |
| 0.751788268955651 | 0.947 |
| 0.752503576537911 | 0.947 |
| 0.753218884120172 | 0.947 |
| 0.753934191702432 | 0.947 |
| 0.754649499284692 | 0.947 |
| 0.755364806866953 | 0.947 |
| 0.756080114449213 | 0.947 |
| 0.756795422031474 | 0.947 |
| 0.757510729613734 | 0.947 |
| 0.758226037195994 | 0.947 |
| 0.758941344778255 | 0.947 |
| 0.759656652360515 | 0.947 |
| 0.760371959942775 | 0.947 |
| 0.761087267525036 | 0.947 |
| 0.761802575107296 | 0.947 |
| 0.762517882689556 | 0.947 |
| 0.763233190271817 | 0.947 |
| 0.763948497854077 | 0.947 |
| 0.764663805436338 | 0.947 |
| 0.765379113018598 | 0.947 |
| 0.766094420600858 | 0.947 |
| 0.766809728183119 | 0.947 |
| 0.767525035765379 | 0.947 |
| 0.768240343347639 | 0.947 |
| 0.7689556509299 | 0.947 |
| 0.76967095851216 | 0.947 |
| 0.770386266094421 | 0.947 |
| 0.771101573676681 | 0.947 |
| 0.771816881258941 | 0.947 |
| 0.772532188841202 | 0.947 |
| 0.773247496423462 | 0.947 |
| 0.773962804005723 | 0.947 |
| 0.774678111587983 | 0.947 |
| 0.775393419170243 | 0.947 |
| 0.776108726752504 | 0.947 |
| 0.776824034334764 | 0.947 |
| 0.777539341917024 | 0.947 |
| 0.778254649499285 | 0.947 |
| 0.778969957081545 | 0.947 |
| 0.779685264663805 | 0.947 |
| 0.780400572246066 | 0.947 |
| 0.781115879828326 | 0.947 |
| 0.781831187410587 | 0.947 |
| 0.782546494992847 | 0.947 |
| 0.783261802575107 | 0.947 |
| 0.783977110157368 | 0.947 |
| 0.784692417739628 | 0.947 |
| 0.785407725321888 | 0.947 |
| 0.786123032904149 | 0.947 |
| 0.786838340486409 | 0.947 |
| 0.78755364806867 | 0.947 |
| 0.78826895565093 | 0.947 |
| 0.78898426323319 | 0.947 |
| 0.789699570815451 | 0.947 |
| 0.790414878397711 | 0.947 |
| 0.791130185979971 | 0.947 |
| 0.791845493562232 | 0.947 |
| 0.792560801144492 | 0.947 |
| 0.793276108726752 | 0.947 |
| 0.793991416309013 | 0.947 |
| 0.794706723891273 | 0.947 |
| 0.795422031473534 | 0.947 |
| 0.796137339055794 | 0.947 |
| 0.796852646638054 | 0.947 |
| 0.797567954220315 | 0.947 |
| 0.798283261802575 | 0.947 |
| 0.798998569384835 | 0.947 |
| 0.799713876967096 | 0.947 |
| 0.800429184549356 | 0.947 |
| 0.801144492131617 | 0.947 |
| 0.801859799713877 | 0.947 |
| 0.802575107296137 | 0.947 |
| 0.803290414878398 | 0.947 |
| 0.804005722460658 | 0.947 |
| 0.804721030042918 | 0.947 |
| 0.805436337625179 | 0.947 |
| 0.806151645207439 | 0.947 |
| 0.8068669527897 | 0.947 |
| 0.80758226037196 | 0.947 |
| 0.80829756795422 | 0.947 |
| 0.809012875536481 | 0.947 |
| 0.809728183118741 | 0.947 |
| 0.810443490701001 | 0.947 |
| 0.811158798283262 | 0.947 |
| 0.811874105865522 | 0.947 |
| 0.812589413447783 | 0.947 |
| 0.813304721030043 | 0.947 |
| 0.814020028612303 | 0.947 |
| 0.814735336194564 | 0.947 |
| 0.815450643776824 | 0.947 |
| 0.816165951359084 | 0.947 |
| 0.816881258941345 | 0.947 |
| 0.817596566523605 | 0.947 |
| 0.818311874105866 | 0.947 |
| 0.819027181688126 | 0.947 |
| 0.819742489270386 | 0.947 |
| 0.820457796852647 | 0.947 |
| 0.821173104434907 | 0.947 |
| 0.821888412017167 | 0.947 |
| 0.822603719599428 | 0.947 |
| 0.823319027181688 | 0.947 |
| 0.824034334763948 | 0.947 |
| 0.824749642346209 | 0.947 |
| 0.825464949928469 | 0.947 |
| 0.82618025751073 | 0.947 |
| 0.82689556509299 | 0.947 |
| 0.82761087267525 | 0.947 |
| 0.828326180257511 | 0.947 |
| 0.829041487839771 | 0.947 |
| 0.829756795422031 | 0.947 |
| 0.830472103004292 | 0.947 |
| 0.831187410586552 | 0.947 |
| 0.831902718168812 | 0.947 |
| 0.832618025751073 | 0.947 |
| 0.833333333333333 | 0.947 |
| 0.834048640915594 | 0.947 |
| 0.834763948497854 | 0.947 |
| 0.835479256080114 | 0.947 |
| 0.836194563662375 | 0.947 |
| 0.836909871244635 | 0.947 |
| 0.837625178826896 | 0.947 |
| 0.838340486409156 | 0.947 |
| 0.839055793991416 | 0.947 |
| 0.839771101573677 | 0.947 |
| 0.840486409155937 | 0.947 |
| 0.841201716738197 | 0.947 |
| 0.841917024320458 | 0.947 |
| 0.842632331902718 | 0.947 |
| 0.843347639484979 | 0.947 |
| 0.844062947067239 | 0.947 |
| 0.844778254649499 | 0.947 |
| 0.84549356223176 | 0.947 |
| 0.84620886981402 | 0.947 |
| 0.84692417739628 | 0.947 |
| 0.847639484978541 | 0.947 |
| 0.848354792560801 | 0.947 |
| 0.849070100143062 | 0.947 |
| 0.849785407725322 | 0.947 |
| 0.850500715307582 | 0.947 |
| 0.851216022889843 | 0.947 |
| 0.851931330472103 | 0.947 |
| 0.852646638054363 | 0.947 |
| 0.853361945636624 | 0.947 |
| 0.854077253218884 | 0.947 |
| 0.854792560801145 | 0.947 |
| 0.855507868383405 | 0.947 |
| 0.856223175965665 | 0.947 |
| 0.856938483547926 | 0.947 |
| 0.857653791130186 | 0.947 |
| 0.858369098712446 | 0.947 |
| 0.859084406294707 | 0.947 |
| 0.859799713876967 | 0.947 |
| 0.860515021459227 | 0.947 |
| 0.861230329041488 | 0.947 |
| 0.861945636623748 | 0.947 |
| 0.862660944206009 | 0.947 |
| 0.863376251788269 | 0.947 |
| 0.864091559370529 | 0.947 |
| 0.86480686695279 | 0.947 |
| 0.86552217453505 | 0.947 |
| 0.86623748211731 | 0.947 |
| 0.866952789699571 | 0.947 |
| 0.867668097281831 | 0.947 |
| 0.867668097281831 | 0.955 |
| 0.867668097281831 | 0.962 |
| 0.867668097281831 | 0.97 |
| 0.868383404864091 | 0.97 |
| 0.869098712446352 | 0.97 |
| 0.869814020028612 | 0.97 |
| 0.870529327610873 | 0.97 |
| 0.871244635193133 | 0.97 |
| 0.871959942775393 | 0.97 |
| 0.872675250357654 | 0.97 |
| 0.873390557939914 | 0.97 |
| 0.874105865522174 | 0.97 |
| 0.874821173104435 | 0.97 |
| 0.875536480686695 | 0.97 |
| 0.876251788268956 | 0.97 |
| 0.876967095851216 | 0.97 |
| 0.877682403433476 | 0.97 |
| 0.878397711015737 | 0.97 |
| 0.879113018597997 | 0.97 |
| 0.879828326180257 | 0.97 |
| 0.880543633762518 | 0.97 |
| 0.881258941344778 | 0.97 |
| 0.881974248927039 | 0.97 |
| 0.882689556509299 | 0.97 |
| 0.883404864091559 | 0.97 |
| 0.88412017167382 | 0.97 |
| 0.88483547925608 | 0.97 |
| 0.885550786838341 | 0.97 |
| 0.886266094420601 | 0.97 |
| 0.886981402002861 | 0.97 |
| 0.887696709585122 | 0.97 |
| 0.888412017167382 | 0.97 |
| 0.889127324749642 | 0.97 |
| 0.889842632331903 | 0.97 |
| 0.890557939914163 | 0.97 |
| 0.891273247496423 | 0.97 |
| 0.891988555078684 | 0.97 |
| 0.892703862660944 | 0.97 |
| 0.893419170243205 | 0.97 |
| 0.894134477825465 | 0.97 |
| 0.894134477825465 | 0.977 |
| 0.894849785407725 | 0.977 |
| 0.895565092989986 | 0.977 |
| 0.896280400572246 | 0.977 |
| 0.896995708154507 | 0.977 |
| 0.897711015736767 | 0.977 |
| 0.898426323319027 | 0.977 |
| 0.899141630901288 | 0.977 |
| 0.899856938483548 | 0.977 |
| 0.900572246065808 | 0.977 |
| 0.901287553648069 | 0.977 |
| 0.902002861230329 | 0.977 |
| 0.902718168812589 | 0.977 |
| 0.90343347639485 | 0.977 |
| 0.90414878397711 | 0.977 |
| 0.90486409155937 | 0.977 |
| 0.905579399141631 | 0.977 |
| 0.906294706723891 | 0.977 |
| 0.907010014306152 | 0.977 |
| 0.907725321888412 | 0.977 |
| 0.908440629470672 | 0.977 |
| 0.909155937052933 | 0.977 |
| 0.909871244635193 | 0.977 |
| 0.910586552217453 | 0.977 |
| 0.911301859799714 | 0.977 |
| 0.912017167381974 | 0.977 |
| 0.912732474964235 | 0.977 |
| 0.913447782546495 | 0.977 |
| 0.914163090128755 | 0.977 |
| 0.914878397711016 | 0.977 |
| 0.915593705293276 | 0.977 |
| 0.916309012875536 | 0.977 |
| 0.917024320457797 | 0.977 |
| 0.917739628040057 | 0.977 |
| 0.918454935622318 | 0.977 |
| 0.919170243204578 | 0.977 |
| 0.919885550786838 | 0.977 |
| 0.920600858369099 | 0.977 |
| 0.921316165951359 | 0.977 |
| 0.922031473533619 | 0.977 |
| 0.922031473533619 | 0.985 |
| 0.92274678111588 | 0.985 |
| 0.92346208869814 | 0.985 |
| 0.9241773962804 | 0.985 |
| 0.924892703862661 | 0.985 |
| 0.925608011444921 | 0.985 |
| 0.926323319027182 | 0.985 |
| 0.927038626609442 | 0.985 |
| 0.927753934191702 | 0.985 |
| 0.928469241773963 | 0.985 |
| 0.929184549356223 | 0.985 |
| 0.929899856938484 | 0.985 |
| 0.930615164520744 | 0.985 |
| 0.931330472103004 | 0.985 |
| 0.932045779685265 | 0.985 |
| 0.932761087267525 | 0.985 |
| 0.933476394849785 | 0.985 |
| 0.934191702432046 | 0.985 |
| 0.934907010014306 | 0.985 |
| 0.935622317596567 | 0.985 |
| 0.936337625178827 | 0.985 |
| 0.937052932761087 | 0.985 |
| 0.937768240343348 | 0.985 |
| 0.938483547925608 | 0.985 |
| 0.939198855507868 | 0.985 |
| 0.939914163090129 | 0.985 |
| 0.940629470672389 | 0.985 |
| 0.94134477825465 | 0.985 |
| 0.94206008583691 | 0.985 |
| 0.94277539341917 | 0.985 |
| 0.943490701001431 | 0.985 |
| 0.944206008583691 | 0.985 |
| 0.944921316165951 | 0.985 |
| 0.945636623748212 | 0.985 |
| 0.946351931330472 | 0.985 |
| 0.947067238912732 | 0.985 |
| 0.947782546494993 | 0.985 |
| 0.948497854077253 | 0.985 |
| 0.949213161659514 | 0.985 |
| 0.949928469241774 | 0.985 |
| 0.950643776824034 | 0.985 |
| 0.951359084406295 | 0.985 |
| 0.952074391988555 | 0.985 |
| 0.952789699570815 | 0.985 |
| 0.953505007153076 | 0.985 |
| 0.954220314735336 | 0.985 |
| 0.954935622317596 | 0.985 |
| 0.955650929899857 | 0.985 |
| 0.956366237482117 | 0.985 |
| 0.956366237482117 | 0.992 |
| 0.956366237482117 | 1 |
| 0.957081545064378 | 1 |
| 0.957796852646638 | 1 |
| 0.958512160228898 | 1 |
| 0.959227467811159 | 1 |
| 0.959942775393419 | 1 |
| 0.96065808297568 | 1 |
| 0.96137339055794 | 1 |
| 0.9620886981402 | 1 |
| 0.962804005722461 | 1 |
| 0.963519313304721 | 1 |
| 0.964234620886981 | 1 |
| 0.964949928469242 | 1 |
| 0.965665236051502 | 1 |
| 0.966380543633762 | 1 |
| 0.967095851216023 | 1 |
| 0.967811158798283 | 1 |
| 0.968526466380544 | 1 |
| 0.969241773962804 | 1 |
| 0.969957081545064 | 1 |
| 0.970672389127325 | 1 |
| 0.971387696709585 | 1 |
| 0.972103004291845 | 1 |
| 0.972818311874106 | 1 |
| 0.973533619456366 | 1 |
| 0.974248927038627 | 1 |
| 0.974964234620887 | 1 |
| 0.975679542203147 | 1 |
| 0.976394849785408 | 1 |
| 0.977110157367668 | 1 |
| 0.977825464949929 | 1 |
| 0.978540772532189 | 1 |
| 0.979256080114449 | 1 |
| 0.97997138769671 | 1 |
| 0.98068669527897 | 1 |
| 0.98140200286123 | 1 |
| 0.982117310443491 | 1 |
| 0.982832618025751 | 1 |
| 0.983547925608011 | 1 |
| 0.984263233190272 | 1 |
| 0.984978540772532 | 1 |
| 0.985693848354793 | 1 |
| 0.986409155937053 | 1 |
| 0.987124463519313 | 1 |
| 0.987839771101574 | 1 |
| 0.988555078683834 | 1 |
| 0.989270386266094 | 1 |
| 0.989985693848355 | 1 |
| 0.990701001430615 | 1 |
| 0.991416309012875 | 1 |
| 0.992131616595136 | 1 |
| 0.992846924177396 | 1 |
| 0.993562231759657 | 1 |
| 0.994277539341917 | 1 |
| 0.994992846924177 | 1 |
| 0.995708154506438 | 1 |
| 0.996423462088698 | 1 |
| 0.997138769670958 | 1 |
| 0.997854077253219 | 1 |
| 0.998569384835479 | 1 |
| 0.99928469241774 | 1 |
| 0.999285203716941 | 1 |